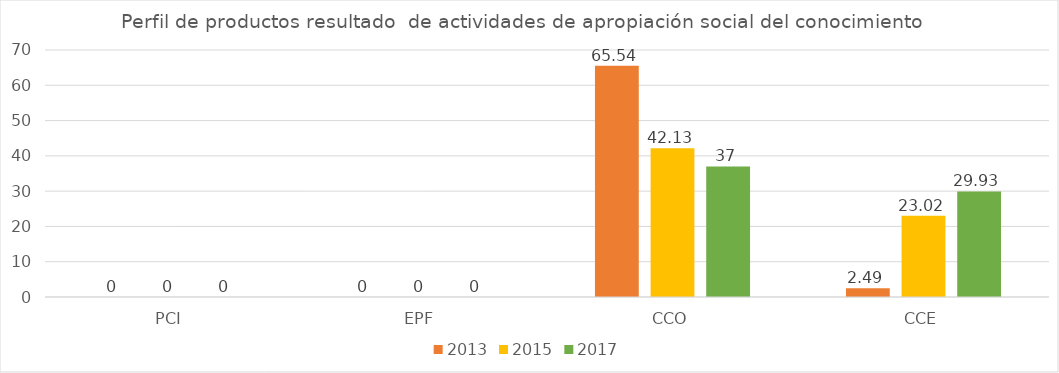
| Category | 2013 | 2015 | 2017 |
|---|---|---|---|
| PCI | 0 | 0 | 0 |
| EPF | 0 | 0 | 0 |
| CCO | 65.54 | 42.13 | 37 |
| CCE | 2.49 | 23.02 | 29.93 |